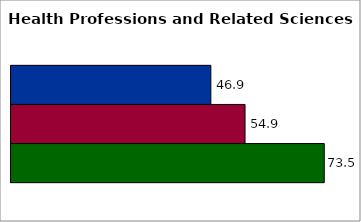
| Category | 50 states and D.C. | SREB states | State |
|---|---|---|---|
| 0 | 46.887 | 54.906 | 73.492 |